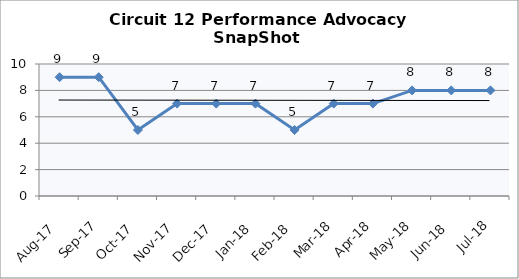
| Category | Circuit 12 |
|---|---|
| Aug-17 | 9 |
| Sep-17 | 9 |
| Oct-17 | 5 |
| Nov-17 | 7 |
| Dec-17 | 7 |
| Jan-18 | 7 |
| Feb-18 | 5 |
| Mar-18 | 7 |
| Apr-18 | 7 |
| May-18 | 8 |
| Jun-18 | 8 |
| Jul-18 | 8 |